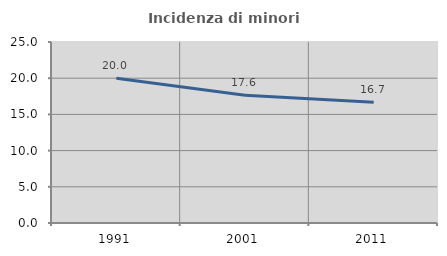
| Category | Incidenza di minori stranieri |
|---|---|
| 1991.0 | 20 |
| 2001.0 | 17.647 |
| 2011.0 | 16.667 |